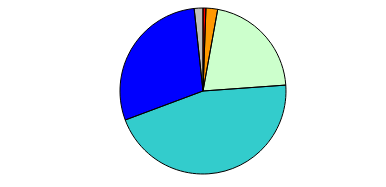
| Category | Series 0 |
|---|---|
| 0 | 1 |
| 1 | 4 |
| 2 | 37 |
| 3 | 80 |
| 4 | 51 |
| 5 | 3 |